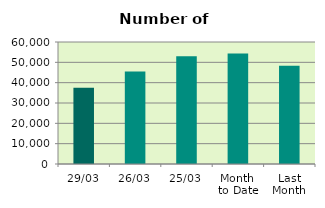
| Category | Series 0 |
|---|---|
| 29/03 | 37552 |
| 26/03 | 45434 |
| 25/03 | 53002 |
| Month 
to Date | 54346.571 |
| Last
Month | 48363.3 |